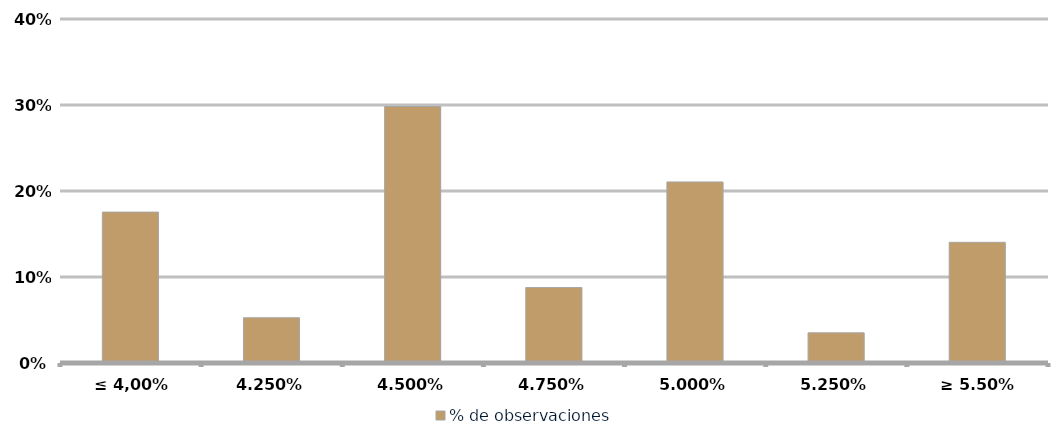
| Category | % de observaciones  |
|---|---|
| ≤ 4,00% | 0.175 |
| 4.25% | 0.053 |
| 4.50% | 0.298 |
| 4.75% | 0.088 |
| 5.00% | 0.211 |
| 5.25% | 0.035 |
| ≥ 5.50% | 0.14 |